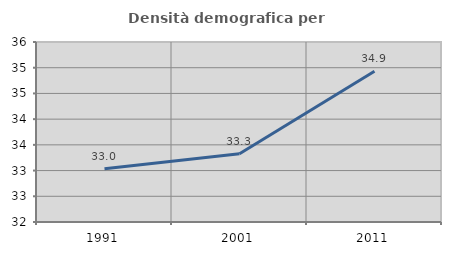
| Category | Densità demografica |
|---|---|
| 1991.0 | 33.037 |
| 2001.0 | 33.325 |
| 2011.0 | 34.932 |